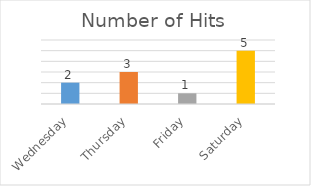
| Category | Number of Hits |
|---|---|
| Wednesday | 2 |
| Thursday | 3 |
| Friday | 1 |
| Saturday | 5 |